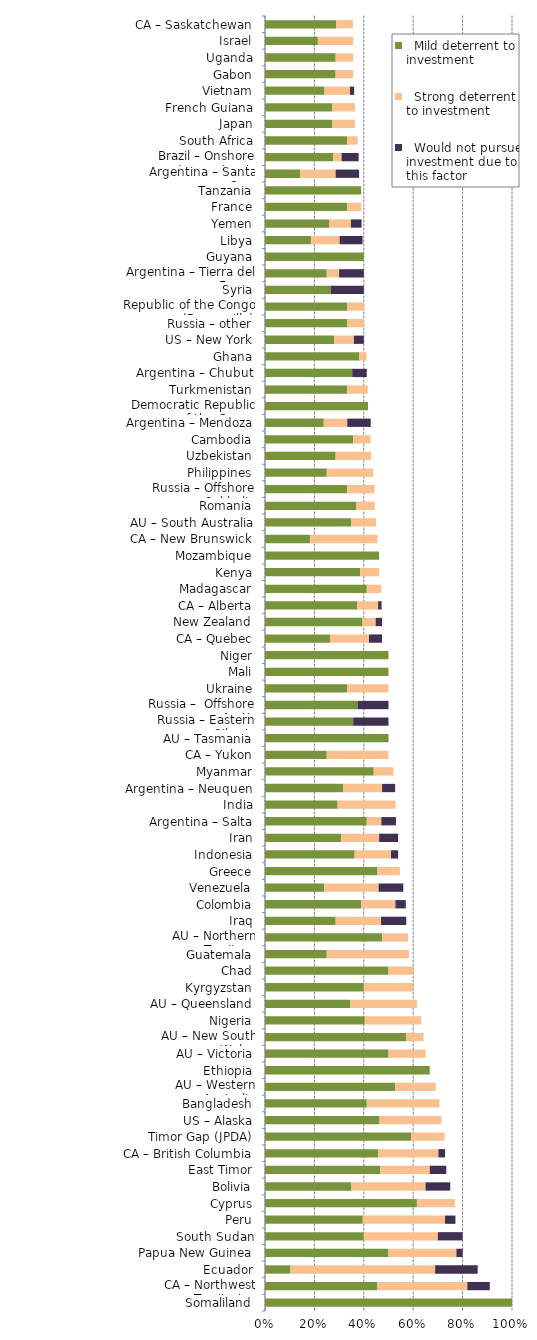
| Category |   Mild deterrent to investment |   Strong deterrent to investment |   Would not pursue investment due to this factor |
|---|---|---|---|
| Somaliland | 1 | 0 | 0 |
| CA – Northwest Territories | 0.455 | 0.364 | 0.091 |
| Ecuador | 0.103 | 0.586 | 0.172 |
| Papua New Guinea | 0.5 | 0.275 | 0.025 |
| South Sudan | 0.4 | 0.3 | 0.1 |
| Peru | 0.396 | 0.333 | 0.042 |
| Cyprus | 0.615 | 0.154 | 0 |
| Bolivia | 0.35 | 0.3 | 0.1 |
| East Timor | 0.467 | 0.2 | 0.067 |
| CA – British Columbia | 0.459 | 0.243 | 0.027 |
| Timor Gap (JPDA) | 0.591 | 0.136 | 0 |
| US – Alaska | 0.464 | 0.25 | 0 |
| Bangladesh | 0.412 | 0.294 | 0 |
| AU – Western Australia | 0.527 | 0.164 | 0 |
| Ethiopia | 0.667 | 0 | 0 |
| AU – Victoria | 0.5 | 0.15 | 0 |
| AU – New South Wales | 0.571 | 0.071 | 0 |
| Nigeria | 0.404 | 0.228 | 0 |
| AU – Queensland | 0.346 | 0.269 | 0 |
| Kyrgyzstan | 0.4 | 0.2 | 0 |
| Chad | 0.5 | 0.1 | 0 |
| Guatemala | 0.25 | 0.333 | 0 |
| AU – Northern Territory | 0.474 | 0.105 | 0 |
| Iraq | 0.286 | 0.184 | 0.102 |
| Colombia | 0.389 | 0.139 | 0.042 |
| Venezuela | 0.24 | 0.22 | 0.1 |
| Greece | 0.455 | 0.091 | 0 |
| Indonesia | 0.363 | 0.147 | 0.029 |
| Iran | 0.308 | 0.154 | 0.077 |
| Argentina – Salta | 0.412 | 0.059 | 0.059 |
| India | 0.294 | 0.235 | 0 |
| Argentina – Neuquen | 0.316 | 0.158 | 0.053 |
| Myanmar | 0.44 | 0.08 | 0 |
| CA – Yukon | 0.25 | 0.25 | 0 |
| AU – Tasmania | 0.5 | 0 | 0 |
| Russia – Eastern Siberia | 0.357 | 0 | 0.143 |
| Russia –  Offshore Arctic | 0.375 | 0 | 0.125 |
| Ukraine | 0.333 | 0.167 | 0 |
| Mali | 0.5 | 0 | 0 |
| Niger | 0.5 | 0 | 0 |
| CA – Quebec | 0.263 | 0.158 | 0.053 |
| New Zealand | 0.395 | 0.053 | 0.026 |
| CA – Alberta | 0.373 | 0.085 | 0.014 |
| Madagascar | 0.412 | 0.059 | 0 |
| Kenya | 0.385 | 0.077 | 0 |
| Mozambique | 0.462 | 0 | 0 |
| CA – New Brunswick | 0.182 | 0.273 | 0 |
| AU – South Australia | 0.35 | 0.1 | 0 |
| Romania | 0.37 | 0.074 | 0 |
| Russia – Offshore Sakhalin | 0.333 | 0.111 | 0 |
| Philippines | 0.25 | 0.188 | 0 |
| Uzbekistan | 0.286 | 0.143 | 0 |
| Cambodia | 0.357 | 0.071 | 0 |
| Argentina – Mendoza | 0.238 | 0.095 | 0.095 |
| Democratic Republic of the Congo (Kinshasa) | 0.417 | 0 | 0 |
| Turkmenistan | 0.333 | 0.083 | 0 |
| Argentina – Chubut | 0.353 | 0 | 0.059 |
| Ghana | 0.382 | 0.029 | 0 |
| US – New York | 0.28 | 0.08 | 0.04 |
| Russia – other | 0.333 | 0.067 | 0 |
| Republic of the Congo (Brazzaville) | 0.333 | 0.067 | 0 |
| Syria | 0.267 | 0 | 0.133 |
| Argentina – Tierra del Fuego | 0.25 | 0.05 | 0.1 |
| Guyana | 0.4 | 0 | 0 |
| Libya | 0.186 | 0.116 | 0.093 |
| Yemen | 0.261 | 0.087 | 0.043 |
| France | 0.333 | 0.056 | 0 |
| Tanzania | 0.389 | 0 | 0 |
| Argentina – Santa Cruz | 0.143 | 0.143 | 0.095 |
| Brazil – Onshore concession contracts | 0.276 | 0.034 | 0.069 |
| South Africa | 0.333 | 0.042 | 0 |
| Japan | 0.273 | 0.091 | 0 |
| French Guiana | 0.273 | 0.091 | 0 |
| Vietnam | 0.241 | 0.103 | 0.017 |
| Gabon | 0.286 | 0.071 | 0 |
| Uganda | 0.286 | 0.071 | 0 |
| Israel | 0.214 | 0.143 | 0 |
| CA – Saskatchewan | 0.288 | 0.068 | 0 |